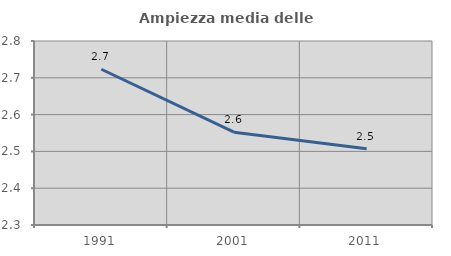
| Category | Ampiezza media delle famiglie |
|---|---|
| 1991.0 | 2.723 |
| 2001.0 | 2.552 |
| 2011.0 | 2.507 |